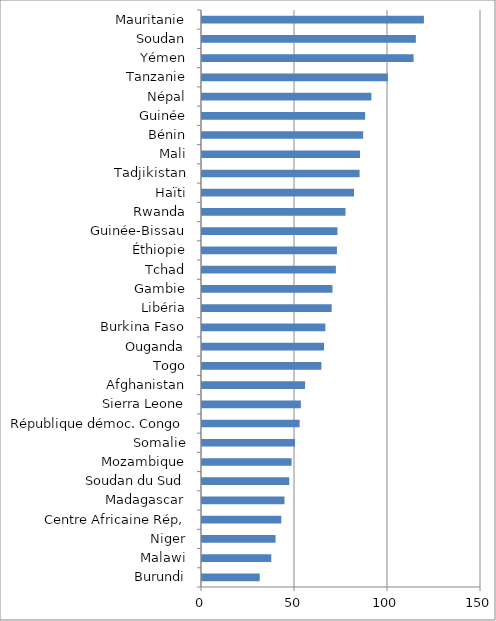
| Category | Series 0 |
|---|---|
| Burundi | 31.039 |
| Malawi | 37.247 |
| Niger | 39.56 |
| Centre Africaine Rép, | 42.63 |
| Madagascar | 44.338 |
| Soudan du Sud | 46.917 |
| Mozambique | 48.192 |
| Somalie | 50.034 |
| République démoc. Congo | 52.487 |
| Sierra Leone | 53.146 |
| Afghanistan | 55.447 |
| Togo | 64.198 |
| Ouganda | 65.607 |
| Burkina Faso | 66.291 |
| Libéria | 69.726 |
| Gambie | 70.166 |
| Tchad | 71.972 |
| Éthiopie | 72.553 |
| Guinée-Bissau | 72.821 |
| Rwanda | 77.145 |
| Haïti | 81.73 |
| Tadjikistan | 84.726 |
| Mali | 84.947 |
| Bénin | 86.652 |
| Guinée | 87.715 |
| Népal | 91.07 |
| Tanzanie | 99.974 |
| Yémen | 113.752 |
| Soudan | 114.974 |
| Mauritanie | 119.315 |